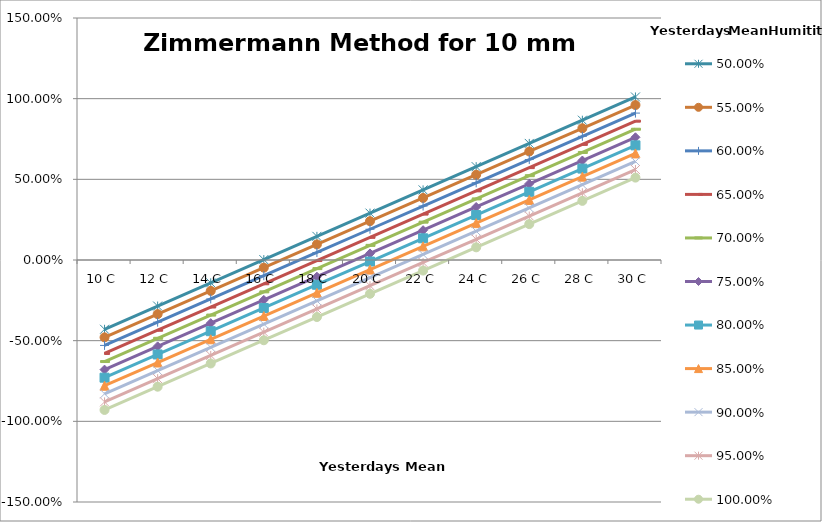
| Category | 50,00% | 55,00% | 60,00% | 65,00% | 70,00% | 75,00% | 80,00% | 85,00% | 90,00% | 95,00% | 100,00% |
|---|---|---|---|---|---|---|---|---|---|---|---|
| 10.0 | -0.429 | -0.479 | -0.529 | -0.579 | -0.629 | -0.679 | -0.729 | -0.779 | -0.829 | -0.879 | -0.929 |
| 12.0 | -0.285 | -0.335 | -0.385 | -0.435 | -0.485 | -0.535 | -0.585 | -0.635 | -0.685 | -0.735 | -0.785 |
| 14.0 | -0.141 | -0.191 | -0.241 | -0.291 | -0.341 | -0.391 | -0.441 | -0.491 | -0.541 | -0.591 | -0.641 |
| 16.0 | 0.003 | -0.047 | -0.097 | -0.147 | -0.197 | -0.247 | -0.297 | -0.347 | -0.397 | -0.447 | -0.497 |
| 18.0 | 0.147 | 0.097 | 0.047 | -0.003 | -0.053 | -0.103 | -0.153 | -0.203 | -0.253 | -0.303 | -0.353 |
| 20.0 | 0.291 | 0.241 | 0.191 | 0.141 | 0.091 | 0.041 | -0.009 | -0.059 | -0.109 | -0.159 | -0.209 |
| 22.0 | 0.435 | 0.385 | 0.335 | 0.285 | 0.235 | 0.185 | 0.135 | 0.085 | 0.035 | -0.015 | -0.065 |
| 24.0 | 0.579 | 0.529 | 0.479 | 0.429 | 0.379 | 0.329 | 0.279 | 0.229 | 0.179 | 0.129 | 0.079 |
| 26.0 | 0.723 | 0.673 | 0.623 | 0.573 | 0.523 | 0.473 | 0.423 | 0.373 | 0.323 | 0.273 | 0.223 |
| 28.0 | 0.867 | 0.817 | 0.767 | 0.717 | 0.667 | 0.617 | 0.567 | 0.517 | 0.467 | 0.417 | 0.367 |
| 30.0 | 1.011 | 0.961 | 0.911 | 0.861 | 0.811 | 0.761 | 0.711 | 0.661 | 0.611 | 0.561 | 0.511 |